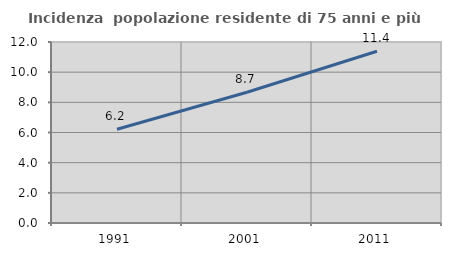
| Category | Incidenza  popolazione residente di 75 anni e più |
|---|---|
| 1991.0 | 6.212 |
| 2001.0 | 8.672 |
| 2011.0 | 11.383 |